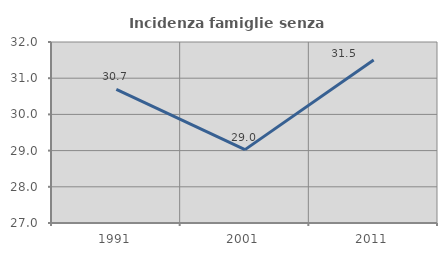
| Category | Incidenza famiglie senza nuclei |
|---|---|
| 1991.0 | 30.688 |
| 2001.0 | 29.027 |
| 2011.0 | 31.502 |